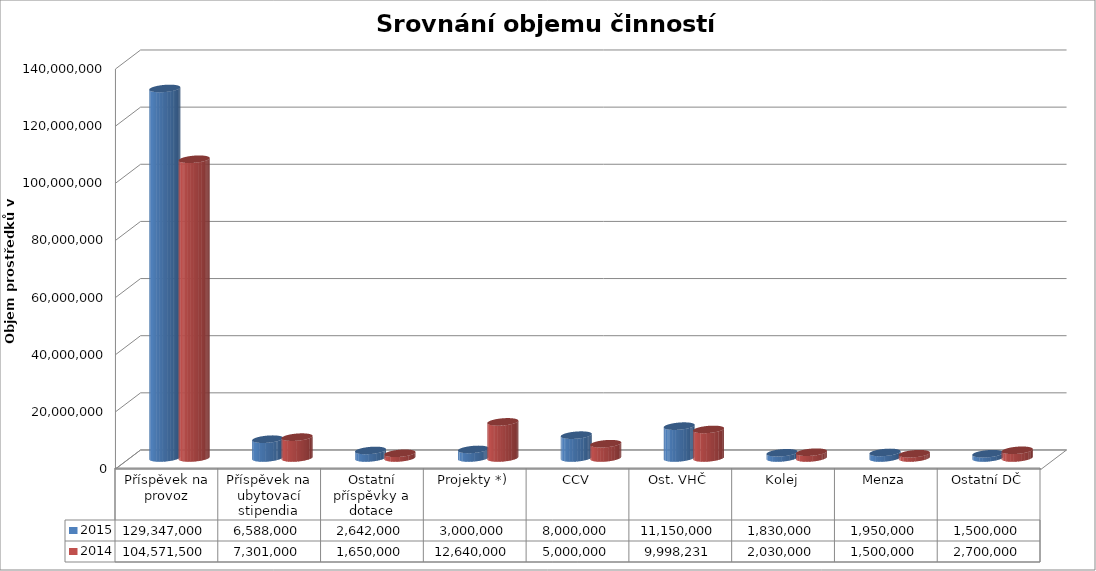
| Category | 2015  | 2014  |
|---|---|---|
| Příspěvek na provoz | 129347000 | 104571500 |
| Příspěvek na ubytovací stipendia | 6588000 | 7301000 |
| Ostatní příspěvky a dotace | 2642000 | 1650000 |
| Projekty *) | 3000000 | 12640000 |
| CCV | 8000000 | 5000000 |
| Ost. VHČ | 11150000 | 9998231 |
| Kolej | 1830000 | 2030000 |
| Menza | 1950000 | 1500000 |
| Ostatní DČ | 1500000 | 2700000 |